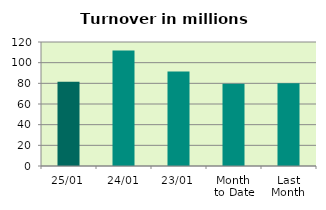
| Category | Series 0 |
|---|---|
| 25/01 | 81.648 |
| 24/01 | 111.863 |
| 23/01 | 91.408 |
| Month 
to Date | 79.572 |
| Last
Month | 79.992 |